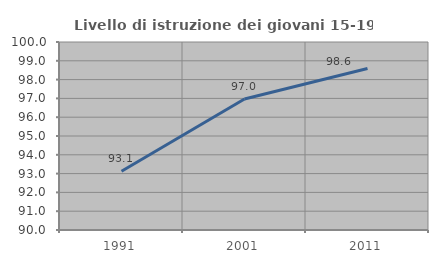
| Category | Livello di istruzione dei giovani 15-19 anni |
|---|---|
| 1991.0 | 93.125 |
| 2001.0 | 96.97 |
| 2011.0 | 98.592 |